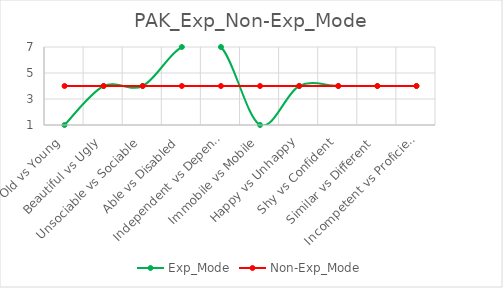
| Category | Exp_Mode | Non-Exp_Mode |
|---|---|---|
| Old vs Young | 1 | 4 |
|  Beautiful vs Ugly | 4 | 4 |
| Unsociable vs Sociable | 4 | 4 |
| Able vs Disabled | 7 | 4 |
| Independent vs Dependent | 7 | 4 |
| Immobile vs Mobile | 1 | 4 |
| Happy vs Unhappy | 4 | 4 |
| Shy vs Confident | 4 | 4 |
| Similar vs Different | 4 | 4 |
| Incompetent vs Proficient | 4 | 4 |